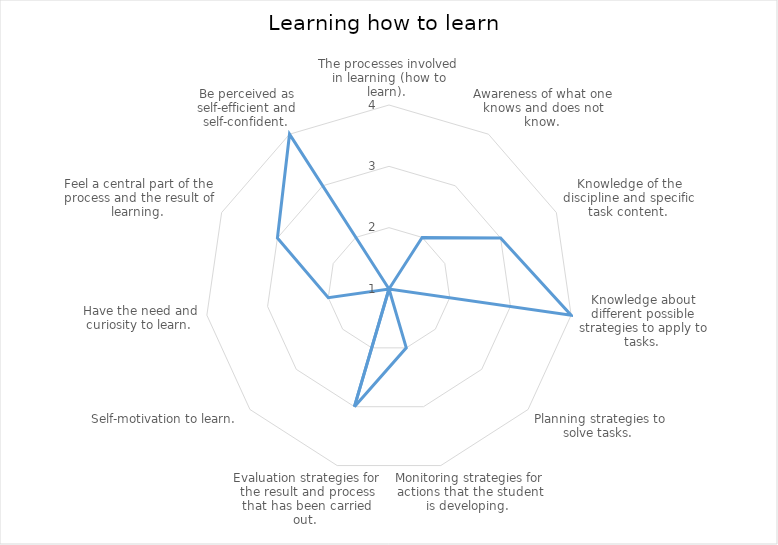
| Category | Series 0 |
|---|---|
| The processes involved in learning (how to learn).  | 1 |
| Awareness of what one knows and does not know.  | 2 |
| Knowledge of the discipline and specific task content.  | 3 |
| Knowledge about different possible strategies to apply to tasks.  | 4 |
| Planning strategies to solve tasks.  | 1 |
| Monitoring strategies for actions that the student is developing.  | 2 |
| Evaluation strategies for the result and process that has been carried out.  | 3 |
| Self-motivation to learn.  | 1 |
| Have the need and curiosity to learn.  | 2 |
| Feel a central part of the process and the result of learning.  | 3 |
| Be perceived as self-efficient and self-confident.  | 4 |